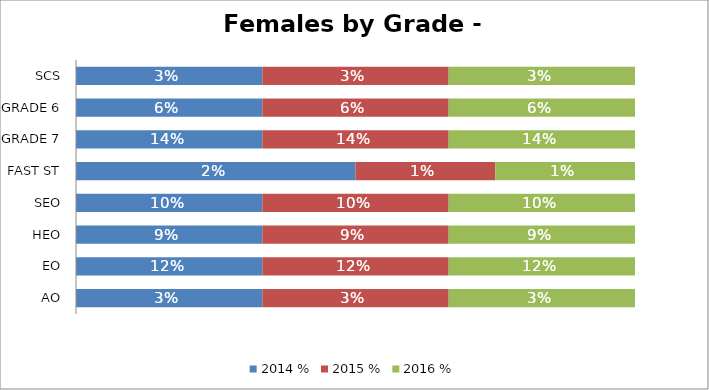
| Category | 2014 % | 2015 % | 2016 % |
|---|---|---|---|
| AO | 0.03 | 0.03 | 0.03 |
| EO | 0.12 | 0.12 | 0.12 |
| HEO | 0.09 | 0.09 | 0.09 |
| SEO | 0.1 | 0.1 | 0.1 |
| FAST ST | 0.02 | 0.01 | 0.01 |
| GRADE 7 | 0.14 | 0.14 | 0.14 |
| GRADE 6 | 0.06 | 0.06 | 0.06 |
| SCS | 0.03 | 0.03 | 0.03 |